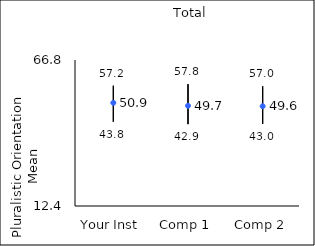
| Category | 25th percentile | 75th percentile | Mean |
|---|---|---|---|
| Your Inst | 43.8 | 57.2 | 50.85 |
| Comp 1 | 42.9 | 57.8 | 49.74 |
| Comp 2 | 43 | 57 | 49.57 |